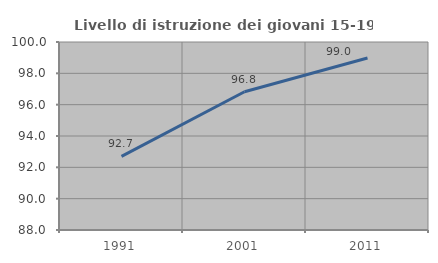
| Category | Livello di istruzione dei giovani 15-19 anni |
|---|---|
| 1991.0 | 92.698 |
| 2001.0 | 96.822 |
| 2011.0 | 98.974 |